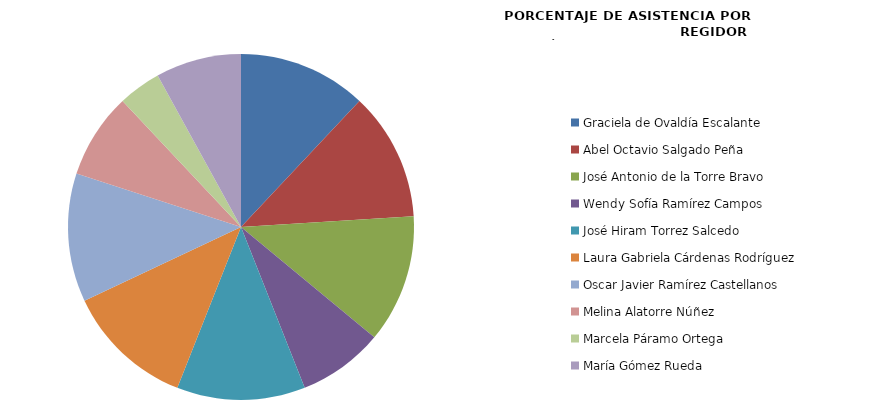
| Category | Series 0 |
|---|---|
| Graciela de Ovaldía Escalante | 100 |
| Abel Octavio Salgado Peña | 100 |
| José Antonio de la Torre Bravo | 100 |
| Wendy Sofía Ramírez Campos | 66.667 |
| José Hiram Torrez Salcedo | 100 |
| Laura Gabriela Cárdenas Rodríguez | 100 |
| Oscar Javier Ramírez Castellanos | 100 |
| Melina Alatorre Núñez | 66.667 |
| Marcela Páramo Ortega | 33.333 |
| María Gómez Rueda | 66.667 |